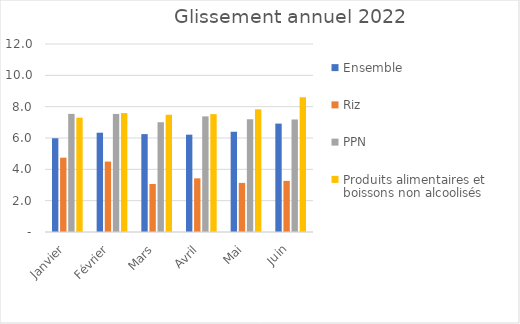
| Category |  Ensemble  |  Riz  |  PPN  |  Produits alimentaires et boissons non alcoolisés  |
|---|---|---|---|---|
| Janvier | 5.984 | 4.745 | 7.54 | 7.297 |
| Février | 6.337 | 4.495 | 7.537 | 7.591 |
| Mars | 6.249 | 3.066 | 7.006 | 7.484 |
| Avril | 6.212 | 3.424 | 7.38 | 7.523 |
| Mai | 6.399 | 3.134 | 7.195 | 7.832 |
| Juin | 6.919 | 3.263 | 7.182 | 8.599 |